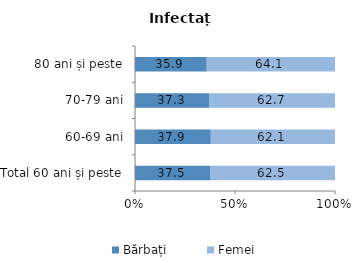
| Category | Bărbați | Femei |
|---|---|---|
| Total 60 ani și peste | 37.5 | 62.5 |
| 60-69 ani | 37.9 | 62.1 |
| 70-79 ani | 37.3 | 62.7 |
| 80 ani și peste | 35.9 | 64.1 |